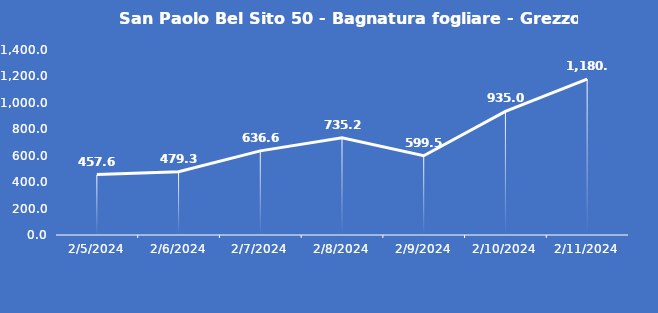
| Category | San Paolo Bel Sito 50 - Bagnatura fogliare - Grezzo (min) |
|---|---|
| 2/5/24 | 457.6 |
| 2/6/24 | 479.3 |
| 2/7/24 | 636.6 |
| 2/8/24 | 735.2 |
| 2/9/24 | 599.5 |
| 2/10/24 | 935 |
| 2/11/24 | 1180 |